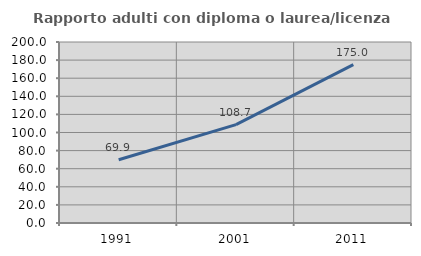
| Category | Rapporto adulti con diploma o laurea/licenza media  |
|---|---|
| 1991.0 | 69.88 |
| 2001.0 | 108.676 |
| 2011.0 | 174.967 |